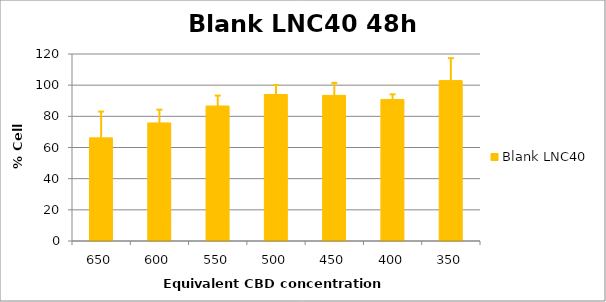
| Category | Blank LNC40 |
|---|---|
| 650.0 | 66.186 |
| 600.0 | 75.754 |
| 550.0 | 86.634 |
| 500.0 | 94.01 |
| 450.0 | 93.449 |
| 400.0 | 90.829 |
| 350.0 | 102.924 |